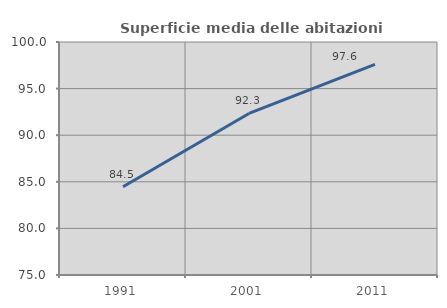
| Category | Superficie media delle abitazioni occupate |
|---|---|
| 1991.0 | 84.474 |
| 2001.0 | 92.333 |
| 2011.0 | 97.602 |